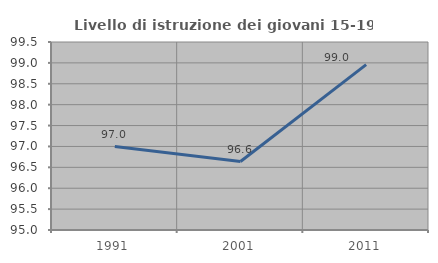
| Category | Livello di istruzione dei giovani 15-19 anni |
|---|---|
| 1991.0 | 96.997 |
| 2001.0 | 96.64 |
| 2011.0 | 98.959 |